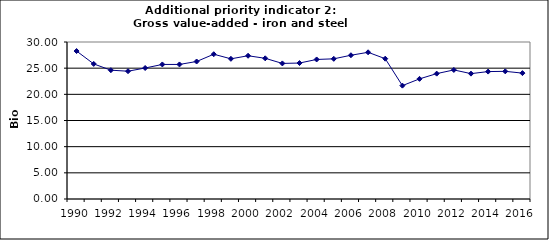
| Category | Gross value-added - iron and steel industry, Bio Euro (EC95) |
|---|---|
| 1990 | 28.273 |
| 1991 | 25.81 |
| 1992 | 24.614 |
| 1993 | 24.419 |
| 1994 | 25.029 |
| 1995 | 25.712 |
| 1996 | 25.712 |
| 1997 | 26.273 |
| 1998 | 27.664 |
| 1999 | 26.785 |
| 2000 | 27.371 |
| 2001 | 26.883 |
| 2002 | 25.907 |
| 2003 | 25.98 |
| 2004 | 26.663 |
| 2005 | 26.785 |
| 2006 | 27.468 |
| 2007 | 28.03 |
| 2008 | 26.81 |
| 2009 | 21.663 |
| 2010 | 22.955 |
| 2011 | 23.956 |
| 2012 | 24.663 |
| 2013 | 23.956 |
| 2014 | 24.346 |
| 2015 | 24.395 |
| 2016 | 24.053 |